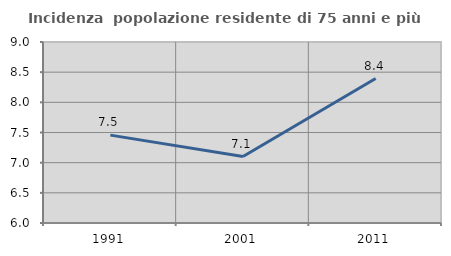
| Category | Incidenza  popolazione residente di 75 anni e più |
|---|---|
| 1991.0 | 7.456 |
| 2001.0 | 7.102 |
| 2011.0 | 8.394 |